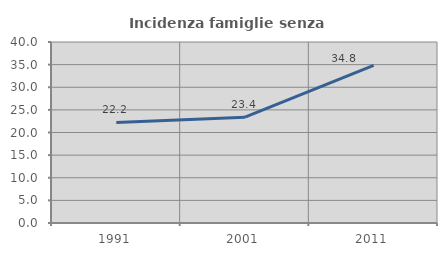
| Category | Incidenza famiglie senza nuclei |
|---|---|
| 1991.0 | 22.225 |
| 2001.0 | 23.379 |
| 2011.0 | 34.818 |